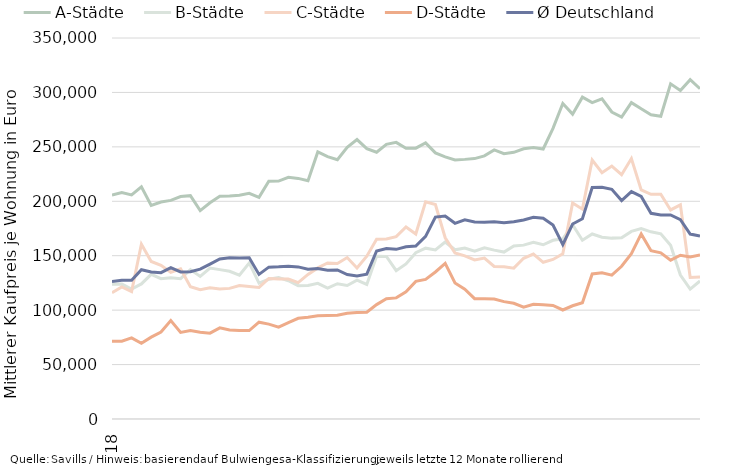
| Category | A-Städte | B-Städte | C-Städte | D-Städte | Ø Deutschland |
|---|---|---|---|---|---|
| 2018-12-31 | 205709.926 | 123816.667 | 115962.181 | 71467.809 | 126374.246 |
| 2019-01-31 | 207970.964 | 123948.37 | 121373.183 | 71491.123 | 127356.534 |
| 2019-02-28 | 205838.69 | 119321.336 | 117072.458 | 74553.964 | 127352.545 |
| 2019-03-31 | 213204.439 | 124066.253 | 160598.48 | 69477.262 | 137135.806 |
| 2019-04-30 | 196149.545 | 132897.412 | 144733.842 | 75180.853 | 135020.136 |
| 2019-05-31 | 199282.305 | 128866.915 | 141149.327 | 79868.433 | 134421.831 |
| 2019-06-30 | 200854.453 | 129700.035 | 134840.177 | 90421.619 | 138998.232 |
| 2019-07-31 | 204311.167 | 128898.092 | 137923.328 | 79521.239 | 135047.998 |
| 2019-08-31 | 205136.066 | 137236.968 | 121441.752 | 81329.034 | 135243.483 |
| 2019-09-30 | 191410.326 | 130947.49 | 118842.145 | 79686.579 | 137618.907 |
| 2019-10-31 | 198598.97 | 138644.708 | 120512.72 | 78885.294 | 142295.828 |
| 2019-11-30 | 204631.523 | 137216.505 | 119443.727 | 83770.905 | 146967.65 |
| 2019-12-31 | 204917.325 | 135712.797 | 119984.782 | 81747.066 | 148159.063 |
| 2020-01-31 | 205629.747 | 132191.235 | 122679.546 | 81411.791 | 147975.818 |
| 2020-02-29 | 207262.591 | 143343.382 | 121785.051 | 81275.114 | 148179.731 |
| 2020-03-31 | 203578.225 | 124803.659 | 120862.884 | 88906.886 | 132820.36 |
| 2020-04-30 | 218373.684 | 128391.295 | 129104.85 | 87164.683 | 139486.255 |
| 2020-05-31 | 218520.348 | 129898.327 | 128570.848 | 84357.807 | 139761.375 |
| 2020-06-30 | 222001.666 | 127016.066 | 128615.06 | 88580.501 | 140335.937 |
| 2020-07-31 | 221031.697 | 122454.934 | 125354.181 | 92485.072 | 139717.772 |
| 2020-08-31 | 218875.682 | 122654.081 | 132857.027 | 93475.061 | 137648.898 |
| 2020-09-30 | 245365.4 | 124663.85 | 138823.263 | 94907.263 | 138196.049 |
| 2020-10-31 | 241067.064 | 120210.857 | 143383.469 | 95170.767 | 136595.517 |
| 2020-11-30 | 238251.942 | 124288.802 | 142835.305 | 95228.113 | 136885.394 |
| 2020-12-31 | 249571.029 | 122663.257 | 148278.706 | 97223.978 | 132718.397 |
| 2021-01-31 | 256680.188 | 127597.81 | 138739.183 | 97788.194 | 131415.309 |
| 2021-02-28 | 248320.394 | 123624.953 | 149568.467 | 98065.992 | 133064.273 |
| 2021-03-31 | 245061.022 | 149465.306 | 165143.857 | 105089.315 | 154375.165 |
| 2021-04-30 | 252269.878 | 149302.079 | 165442.082 | 110470.059 | 156635.306 |
| 2021-05-31 | 254139.048 | 136241.769 | 167556.146 | 111258.061 | 155851.365 |
| 2021-06-30 | 248621.632 | 142411.274 | 176434.535 | 116777.852 | 158223.002 |
| 2021-07-31 | 248789.853 | 152796.229 | 169920.52 | 126445.429 | 158855.81 |
| 2021-08-31 | 253572.822 | 156946.577 | 199504.328 | 128182.665 | 167764.734 |
| 2021-09-30 | 244426.106 | 155277.206 | 197061.564 | 135035.491 | 185444.246 |
| 2021-10-31 | 240858.098 | 162564.865 | 166482.489 | 142902.828 | 186510.757 |
| 2021-11-30 | 237991.28 | 155446.5 | 152527.17 | 124894.274 | 179769.112 |
| 2021-12-31 | 238498.406 | 157041.296 | 149832.266 | 119262.355 | 182995.149 |
| 2022-01-31 | 239208.121 | 154216.436 | 146078.771 | 110564.847 | 180961.93 |
| 2022-02-28 | 241740.168 | 157265.229 | 147884.541 | 110505.8 | 180735.044 |
| 2022-03-31 | 247145.235 | 155138.135 | 140176.015 | 110215.226 | 181090.941 |
| 2022-04-30 | 243697.345 | 153343.742 | 139922.98 | 107797.862 | 180251.045 |
| 2022-05-31 | 245004.665 | 159010.146 | 138587.104 | 106267.694 | 181224.058 |
| 2022-06-30 | 248259.104 | 159712.858 | 147671.425 | 102668.404 | 182840.443 |
| 2022-07-31 | 249367.736 | 162349.229 | 151546.071 | 105423.106 | 185244.952 |
| 2022-08-31 | 248043.367 | 160044.818 | 143963.04 | 104845.701 | 184401.883 |
| 2022-09-30 | 266951.272 | 164140.818 | 146546.501 | 104351.086 | 178207.601 |
| 2022-10-31 | 289764.583 | 165491.921 | 151839.867 | 100147.155 | 160254.138 |
| 2022-11-30 | 280061.403 | 178480.835 | 198545.4 | 104019.545 | 179121.702 |
| 2022-12-31 | 295678.315 | 164235.058 | 192775.415 | 106761.3 | 183963.595 |
| 2023-01-31 | 290631.981 | 169975.35 | 237937.406 | 133225.038 | 212688.292 |
| 2023-02-28 | 294149.413 | 166970.86 | 226276.195 | 134277.104 | 212829.504 |
| 2023-03-31 | 282010.462 | 166159.228 | 232304.322 | 132080.257 | 210979.676 |
| 2023-04-30 | 277449.586 | 166474.276 | 224433.769 | 140333.949 | 200670.254 |
| 2023-05-31 | 290627.006 | 172354.669 | 239248.629 | 151828.298 | 208935.599 |
| 2023-06-30 | 284915.94 | 174850.194 | 210440.535 | 169985.824 | 204492.945 |
| 2023-07-31 | 279499.206 | 171933.921 | 206443.634 | 154541.407 | 188965.975 |
| 2023-08-31 | 278088.129 | 170053.809 | 206477.932 | 152600.633 | 187470.019 |
| 2023-09-30 | 307939.754 | 159546.039 | 192050.907 | 145933.454 | 187462.827 |
| 2023-10-31 | 301833.075 | 132282.098 | 196752.059 | 150449.68 | 183101.164 |
| 2023-11-30 | 311712.064 | 119309.31 | 130074.981 | 148847.333 | 169897.352 |
| 2023-12-31 | 303402.787 | 126807.259 | 130552.636 | 150602.341 | 168021.722 |